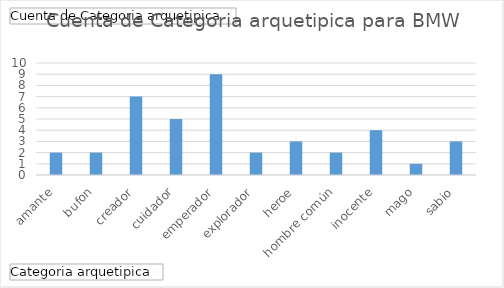
| Category | Total |
|---|---|
| amante | 2 |
| bufon | 2 |
| creador | 7 |
| cuidador | 5 |
| emperador | 9 |
| explorador | 2 |
| heroe | 3 |
| hombre común | 2 |
| inocente | 4 |
| mago | 1 |
| sabio | 3 |